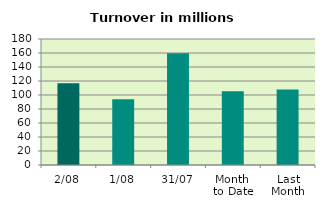
| Category | Series 0 |
|---|---|
| 2/08 | 116.857 |
| 1/08 | 93.941 |
| 31/07 | 159.584 |
| Month 
to Date | 105.399 |
| Last
Month | 108.022 |